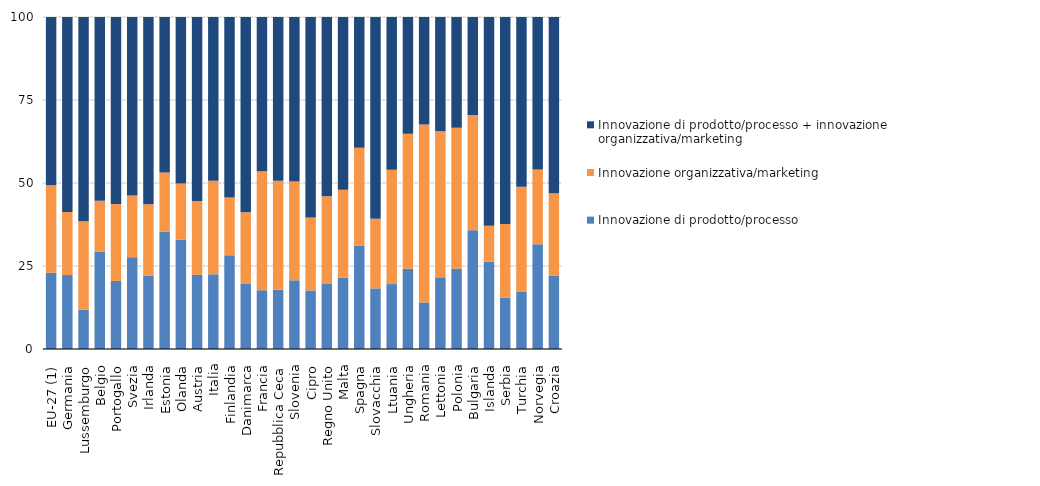
| Category | Innovazione di prodotto/processo | Innovazione organizzativa/marketing | Innovazione di prodotto/processo + innovazione organizzativa/marketing |
|---|---|---|---|
| EU-27 (1) | 22.969 | 26.369 | 50.661 |
| Germania | 22.275 | 19.009 | 58.716 |
| Lussemburgo | 11.874 | 26.583 | 61.543 |
| Belgio | 29.369 | 15.26 | 55.371 |
| Portogallo | 20.5 | 23.152 | 56.347 |
| Svezia | 27.665 | 18.566 | 53.769 |
| Irlanda | 22.149 | 21.444 | 56.406 |
| Estonia | 35.31 | 17.84 | 46.851 |
| Olanda | 32.898 | 16.943 | 50.159 |
| Austria | 22.33 | 22.242 | 55.428 |
| Italia | 22.487 | 28.206 | 49.307 |
| Finlandia | 28.206 | 17.411 | 54.384 |
| Danimarca | 19.58 | 21.607 | 58.813 |
| Francia | 17.708 | 35.826 | 46.466 |
| Repubblica Ceca | 17.914 | 32.753 | 49.333 |
| Slovenia | 20.692 | 29.743 | 49.565 |
| Cipro | 17.645 | 21.996 | 60.359 |
| Regno Unito | 19.752 | 26.275 | 53.973 |
| Malta | 21.521 | 26.481 | 51.998 |
| Spagna | 31.199 | 29.41 | 39.391 |
| Slovacchia | 18.253 | 20.949 | 60.798 |
| Ltuania | 19.553 | 34.407 | 46.04 |
| Ungheria | 24.139 | 40.715 | 35.146 |
| Romania | 14.017 | 53.634 | 32.349 |
| Lettonia | 21.594 | 43.957 | 34.449 |
| Polonia | 24.2 | 42.466 | 33.333 |
| Bulgaria | 35.78 | 34.71 | 29.509 |
| Islanda | 26.269 | 10.887 | 62.845 |
| Serbia | 15.419 | 22.248 | 62.333 |
| Turchia | 17.329 | 31.542 | 51.129 |
| Norvegia | 31.534 | 22.531 | 45.935 |
| Croazia | 22.036 | 24.888 | 53.076 |